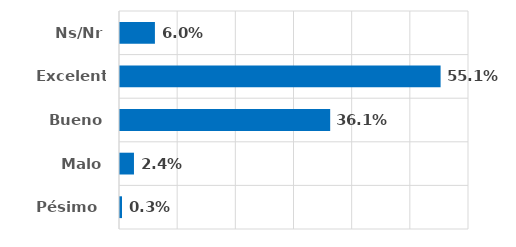
| Category | Series 0 |
|---|---|
| Pésimo  | 0.003 |
| Malo | 0.024 |
| Bueno | 0.361 |
| Excelente | 0.551 |
| Ns/Nr | 0.06 |